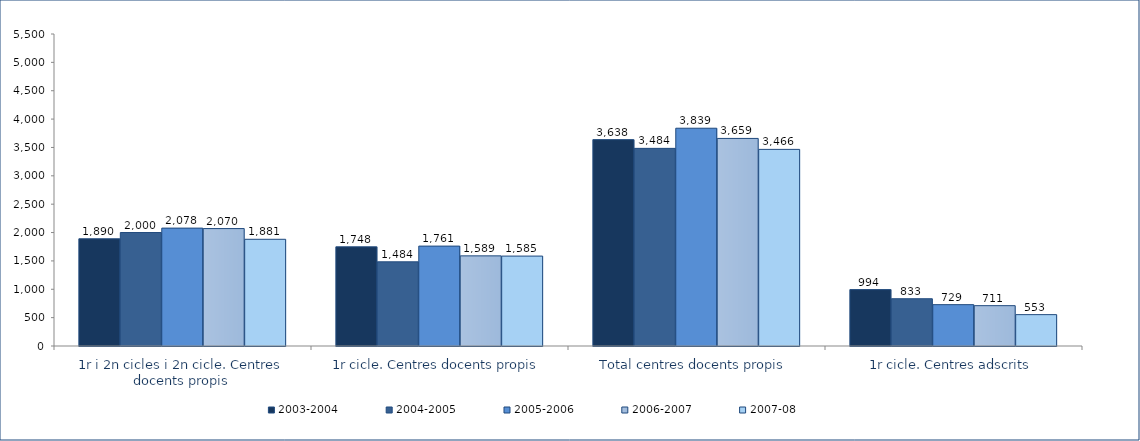
| Category | 2003-2004 | 2004-2005 | 2005-2006 | 2006-2007 | 2007-08 |
|---|---|---|---|---|---|
| 1r i 2n cicles i 2n cicle. Centres docents propis | 1890 | 2000 | 2078 | 2070 | 1881 |
| 1r cicle. Centres docents propis | 1748 | 1484 | 1761 | 1589 | 1585 |
| Total centres docents propis | 3638 | 3484 | 3839 | 3659 | 3466 |
| 1r cicle. Centres adscrits | 994 | 833 | 729 | 711 | 553 |